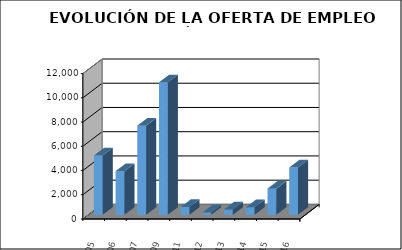
| Category | Series 0 |
|---|---|
| 2005.0 | 4895 |
| 2006.0 | 3604 |
| 2007.0 | 7362 |
| 2009.0 | 10934 |
| 2011.0 | 645 |
| 2012.0 | 190 |
| 2013.0 | 449 |
| 2014.0 | 624 |
| 2015.0 | 2163 |
| 2016.0 | 3907 |